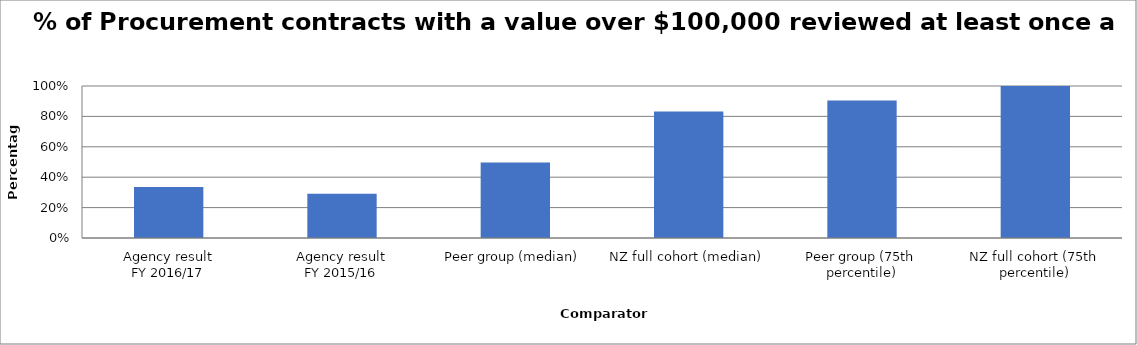
| Category | Series 0 |
|---|---|
| Agency result
FY 2016/17 | 0.335 |
| Agency result
FY 2015/16 | 0.29 |
| Peer group (median) | 0.496 |
| NZ full cohort (median) | 0.833 |
| Peer group (75th percentile) | 0.905 |
| NZ full cohort (75th percentile) | 1 |